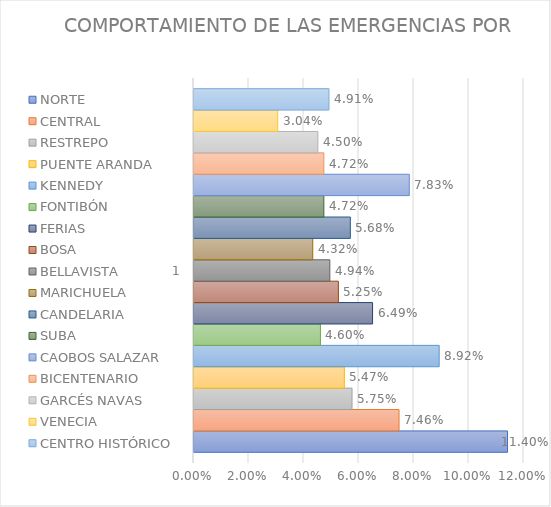
| Category | NORTE | CENTRAL | RESTREPO | PUENTE ARANDA | KENNEDY | FONTIBÓN | FERIAS | BOSA | BELLAVISTA | MARICHUELA | CANDELARIA | SUBA | CAOBOS SALAZAR | BICENTENARIO | GARCÉS NAVAS | VENECIA | CENTRO HISTÓRICO |
|---|---|---|---|---|---|---|---|---|---|---|---|---|---|---|---|---|---|
| 0 | 0.114 | 0.075 | 0.057 | 0.055 | 0.089 | 0.046 | 0.065 | 0.053 | 0.049 | 0.043 | 0.057 | 0.047 | 0.078 | 0.047 | 0.045 | 0.03 | 0.049 |